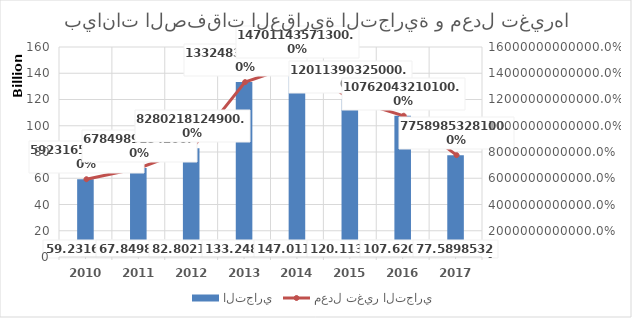
| Category | التجاري |
|---|---|
| 2010 | 42783066807 |
| 2011 | 42676116517 |
| 2012 | 42028900820 |
| 2013 | 53706104925 |
| 2014 | 59343617231 |
| 2015 | 53650903850 |
| 2016 | 45779913933 |
| 2017 | 35105573648 |